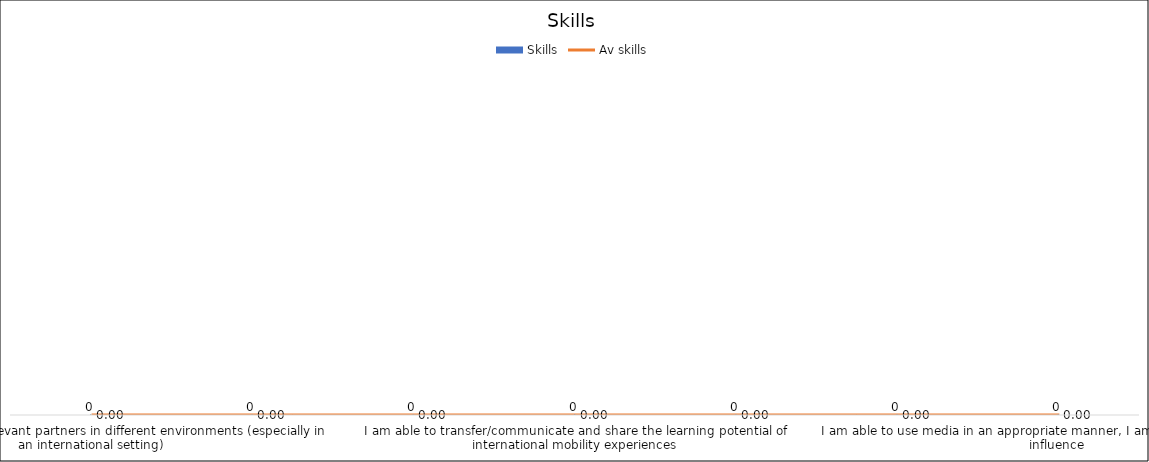
| Category | Skills |
|---|---|
| I am able to identify relevant partners in different environments (especially in an international setting) | 0 |
| I am  able to identify and name the European/international dimension in one’s work | 0 |
| I am able to network with a variety of external systems and actors | 0 |
| I am able to transfer/communicate and share the learning potential of international mobility experiences | 0 |
| I am able to identify underlying power relations and mechanisms and to assess the consequences | 0 |
| I am able to research and access relevant information | 0 |
| I am able to use media in an appropriate manner, I am  aware of their possible influence  | 0 |